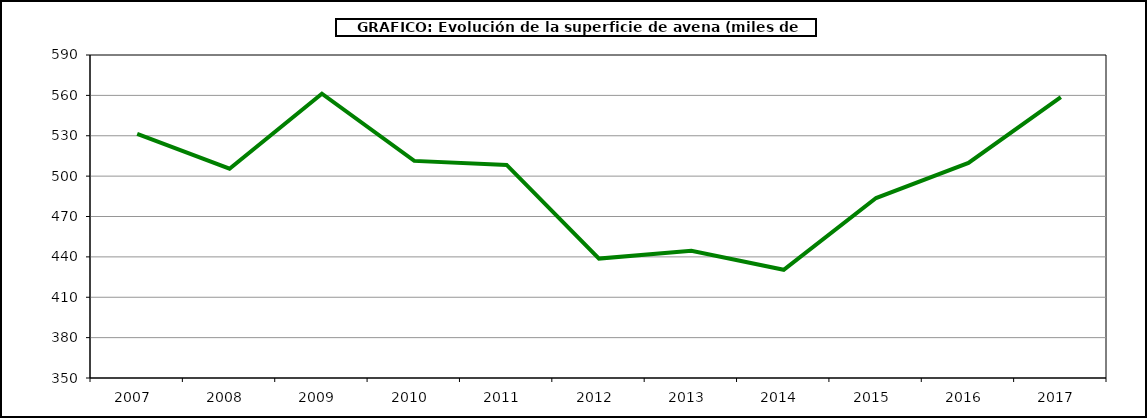
| Category | Superficie |
|---|---|
| 2007.0 | 531.432 |
| 2008.0 | 505.511 |
| 2009.0 | 561.238 |
| 2010.0 | 511.329 |
| 2011.0 | 508.344 |
| 2012.0 | 438.745 |
| 2013.0 | 444.474 |
| 2014.0 | 430.419 |
| 2015.0 | 483.727 |
| 2016.0 | 509.849 |
| 2017.0 | 558.767 |